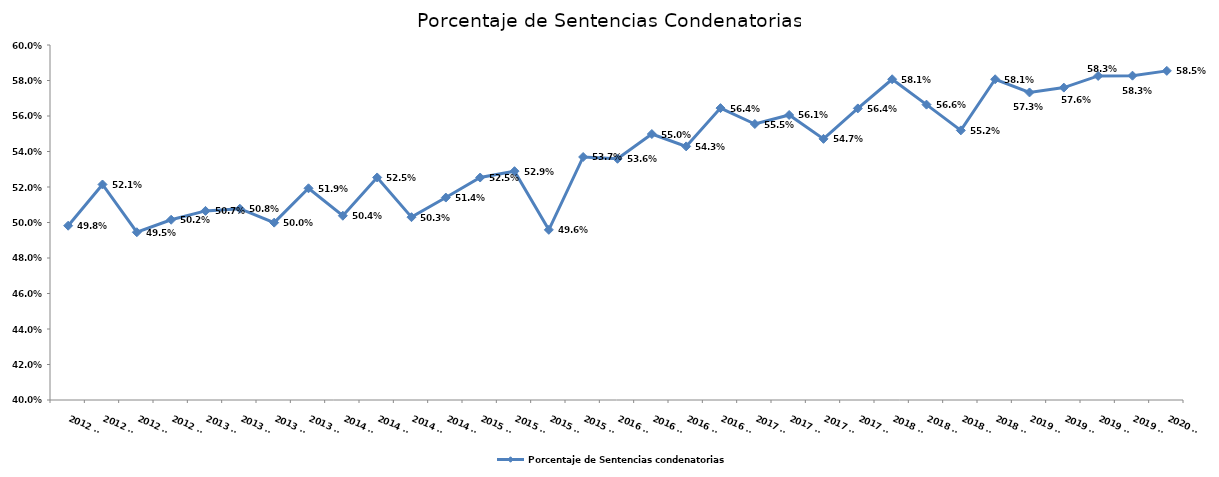
| Category | Porcentaje de Sentencias condenatorias |
|---|---|
| 2012 T1 | 0.498 |
| 2012 T2 | 0.521 |
| 2012 T3 | 0.495 |
| 2012 T4 | 0.502 |
| 2013 T1 | 0.507 |
| 2013 T2 | 0.508 |
| 2013 T3 | 0.5 |
| 2013 T4 | 0.519 |
| 2014 T1 | 0.504 |
| 2014 T2 | 0.525 |
| 2014 T3 | 0.503 |
| 2014 T4 | 0.514 |
| 2015 T1 | 0.525 |
| 2015 T2 | 0.529 |
| 2015 T3 | 0.496 |
| 2015 T4 | 0.537 |
| 2016 T1 | 0.536 |
| 2016 T2 | 0.55 |
| 2016 T3 | 0.543 |
| 2016 T4 | 0.564 |
| 2017 T1 | 0.555 |
| 2017 T2 | 0.561 |
| 2017 T3 | 0.547 |
| 2017 T4 | 0.564 |
| 2018 T1 | 0.581 |
| 2018 T2 | 0.566 |
| 2018 T3 | 0.552 |
| 2018 T4 | 0.581 |
| 2019 T1 | 0.573 |
| 2019 T2 | 0.576 |
| 2019 T3 | 0.583 |
| 2019 T4 | 0.583 |
| 2020 T1 | 0.585 |